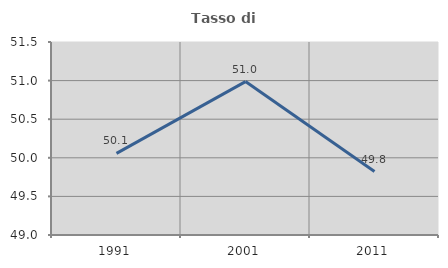
| Category | Tasso di occupazione   |
|---|---|
| 1991.0 | 50.058 |
| 2001.0 | 50.987 |
| 2011.0 | 49.821 |